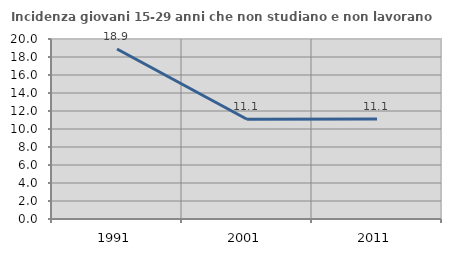
| Category | Incidenza giovani 15-29 anni che non studiano e non lavorano  |
|---|---|
| 1991.0 | 18.889 |
| 2001.0 | 11.084 |
| 2011.0 | 11.111 |